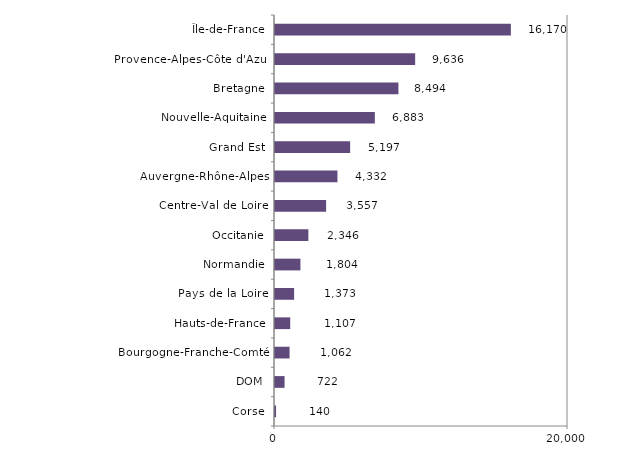
| Category | Series 0 |
|---|---|
| Corse | 140 |
| DOM | 722 |
| Bourgogne-Franche-Comté | 1062 |
| Hauts-de-France | 1107 |
| Pays de la Loire | 1373 |
| Normandie | 1804 |
| Occitanie | 2346 |
| Centre-Val de Loire | 3557 |
| Auvergne-Rhône-Alpes | 4332 |
| Grand Est | 5197 |
| Nouvelle-Aquitaine | 6883 |
| Bretagne | 8494 |
| Provence-Alpes-Côte d'Azur | 9636 |
| Île-de-France | 16170 |